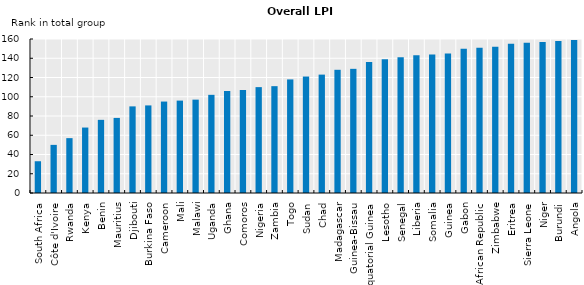
| Category | Rank |
|---|---|
| South Africa | 33 |
| Côte d'Ivoire | 50 |
| Rwanda | 57 |
| Kenya | 68 |
| Benin | 76 |
| Mauritius | 78 |
| Djibouti | 90 |
| Burkina Faso | 91 |
| Cameroon | 95 |
| Mali | 96 |
| Malawi | 97 |
| Uganda | 102 |
| Ghana | 106 |
| Comoros | 107 |
| Nigeria | 110 |
| Zambia | 111 |
| Togo | 118 |
| Sudan | 121 |
| Chad | 123 |
| Madagascar | 128 |
| Guinea-Bissau | 129 |
| Equatorial Guinea | 136 |
| Lesotho | 139 |
| Senegal | 141 |
| Liberia | 143 |
| Somalia | 144 |
| Guinea | 145 |
| Gabon | 150 |
| Central African Republic | 151 |
| Zimbabwe | 152 |
| Eritrea | 155 |
| Sierra Leone | 156 |
| Niger | 157 |
| Burundi | 158 |
| Angola | 159 |